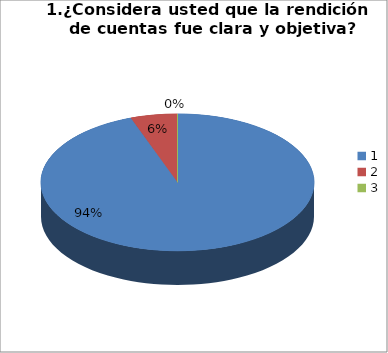
| Category | Series 0 |
|---|---|
| 0 | 51 |
| 1 | 3 |
| 2 | 0 |